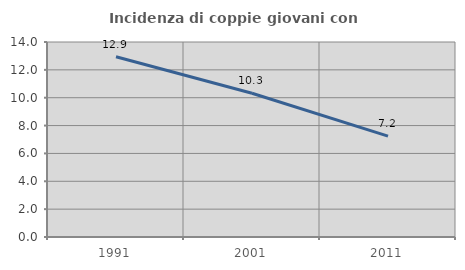
| Category | Incidenza di coppie giovani con figli |
|---|---|
| 1991.0 | 12.944 |
| 2001.0 | 10.324 |
| 2011.0 | 7.241 |